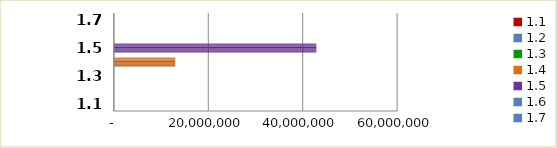
| Category | Series 0 |
|---|---|
| 1.1 | 0 |
| 1.2 | 0 |
| 1.3 | 0 |
| 1.4 | 12991800 |
| 1.5 | 42887443 |
| 1.6 | 0 |
| 1.7 | 0 |